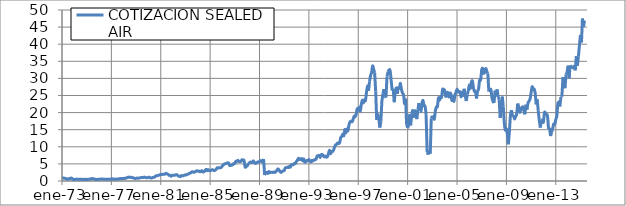
| Category | COTIZACIÓN SEALED AIR |
|---|---|
| 26666.0 | 1 |
| 26697.0 | 0.898 |
| 26725.0 | 0.805 |
| 26756.0 | 0.797 |
| 26786.0 | 0.656 |
| 26817.0 | 0.594 |
| 26847.0 | 0.555 |
| 26878.0 | 0.719 |
| 26909.0 | 0.688 |
| 26939.0 | 0.883 |
| 26970.0 | 0.68 |
| 27000.0 | 0.469 |
| 27031.0 | 0.477 |
| 27062.0 | 0.445 |
| 27090.0 | 0.555 |
| 27121.0 | 0.508 |
| 27151.0 | 0.477 |
| 27182.0 | 0.477 |
| 27212.0 | 0.492 |
| 27243.0 | 0.523 |
| 27274.0 | 0.492 |
| 27304.0 | 0.406 |
| 27335.0 | 0.484 |
| 27365.0 | 0.5 |
| 27396.0 | 0.43 |
| 27427.0 | 0.484 |
| 27455.0 | 0.523 |
| 27486.0 | 0.555 |
| 27516.0 | 0.562 |
| 27547.0 | 0.711 |
| 27577.0 | 0.703 |
| 27608.0 | 0.594 |
| 27639.0 | 0.547 |
| 27669.0 | 0.438 |
| 27700.0 | 0.414 |
| 27730.0 | 0.484 |
| 27761.0 | 0.508 |
| 27792.0 | 0.516 |
| 27821.0 | 0.594 |
| 27852.0 | 0.578 |
| 27882.0 | 0.547 |
| 27913.0 | 0.484 |
| 27943.0 | 0.547 |
| 27974.0 | 0.516 |
| 28005.0 | 0.531 |
| 28035.0 | 0.516 |
| 28066.0 | 0.477 |
| 28096.0 | 0.5 |
| 28127.0 | 0.641 |
| 28158.0 | 0.633 |
| 28186.0 | 0.508 |
| 28217.0 | 0.547 |
| 28247.0 | 0.586 |
| 28278.0 | 0.516 |
| 28308.0 | 0.547 |
| 28339.0 | 0.656 |
| 28370.0 | 0.656 |
| 28400.0 | 0.766 |
| 28431.0 | 0.656 |
| 28461.0 | 0.734 |
| 28492.0 | 0.711 |
| 28523.0 | 0.805 |
| 28551.0 | 0.766 |
| 28582.0 | 0.922 |
| 28612.0 | 1.062 |
| 28643.0 | 1.141 |
| 28673.0 | 1.039 |
| 28704.0 | 1.133 |
| 28735.0 | 0.977 |
| 28765.0 | 0.961 |
| 28796.0 | 0.844 |
| 28826.0 | 0.734 |
| 28857.0 | 0.773 |
| 28888.0 | 0.875 |
| 28916.0 | 0.828 |
| 28947.0 | 0.844 |
| 28977.0 | 0.945 |
| 29008.0 | 1 |
| 29038.0 | 1.008 |
| 29069.0 | 1.008 |
| 29100.0 | 1.148 |
| 29130.0 | 1.031 |
| 29161.0 | 0.938 |
| 29191.0 | 0.953 |
| 29222.0 | 1.086 |
| 29253.0 | 1.07 |
| 29282.0 | 0.922 |
| 29313.0 | 0.867 |
| 29343.0 | 1.016 |
| 29374.0 | 1.062 |
| 29404.0 | 1.125 |
| 29435.0 | 1.445 |
| 29466.0 | 1.562 |
| 29496.0 | 1.57 |
| 29527.0 | 1.711 |
| 29557.0 | 1.734 |
| 29588.0 | 1.953 |
| 29619.0 | 1.867 |
| 29647.0 | 1.953 |
| 29678.0 | 1.938 |
| 29708.0 | 1.984 |
| 29739.0 | 2.242 |
| 29769.0 | 2.102 |
| 29800.0 | 1.961 |
| 29831.0 | 1.703 |
| 29861.0 | 1.672 |
| 29892.0 | 1.383 |
| 29922.0 | 1.641 |
| 29953.0 | 1.695 |
| 29984.0 | 1.648 |
| 30012.0 | 1.727 |
| 30043.0 | 1.812 |
| 30073.0 | 1.805 |
| 30104.0 | 1.477 |
| 30134.0 | 1.398 |
| 30165.0 | 1.266 |
| 30196.0 | 1.586 |
| 30226.0 | 1.5 |
| 30257.0 | 1.562 |
| 30287.0 | 1.734 |
| 30318.0 | 1.719 |
| 30349.0 | 1.836 |
| 30377.0 | 1.984 |
| 30408.0 | 2.047 |
| 30438.0 | 2.234 |
| 30469.0 | 2.359 |
| 30499.0 | 2.609 |
| 30530.0 | 2.719 |
| 30561.0 | 2.516 |
| 30591.0 | 2.656 |
| 30622.0 | 2.781 |
| 30652.0 | 3 |
| 30683.0 | 2.875 |
| 30714.0 | 2.922 |
| 30743.0 | 2.688 |
| 30774.0 | 2.812 |
| 30804.0 | 3.016 |
| 30835.0 | 2.625 |
| 30865.0 | 2.734 |
| 30896.0 | 3 |
| 30927.0 | 3.406 |
| 30957.0 | 3 |
| 30988.0 | 3.344 |
| 31018.0 | 3.062 |
| 31049.0 | 3 |
| 31080.0 | 3.141 |
| 31108.0 | 3.281 |
| 31139.0 | 3.219 |
| 31169.0 | 3.031 |
| 31200.0 | 3.188 |
| 31230.0 | 3.469 |
| 31261.0 | 3.875 |
| 31292.0 | 3.797 |
| 31322.0 | 3.891 |
| 31353.0 | 3.844 |
| 31383.0 | 4.031 |
| 31414.0 | 4.438 |
| 31445.0 | 4.734 |
| 31473.0 | 4.984 |
| 31504.0 | 5.047 |
| 31534.0 | 5.188 |
| 31565.0 | 5.297 |
| 31595.0 | 5.25 |
| 31626.0 | 4.547 |
| 31657.0 | 4.547 |
| 31687.0 | 4.641 |
| 31718.0 | 4.75 |
| 31748.0 | 5.094 |
| 31779.0 | 5.141 |
| 31810.0 | 5.781 |
| 31838.0 | 5.672 |
| 31869.0 | 6.062 |
| 31899.0 | 5.719 |
| 31930.0 | 5.703 |
| 31960.0 | 5.734 |
| 31991.0 | 6.203 |
| 32022.0 | 6.062 |
| 32052.0 | 6.016 |
| 32083.0 | 4.109 |
| 32113.0 | 4.234 |
| 32144.0 | 4.406 |
| 32175.0 | 4.891 |
| 32204.0 | 5.25 |
| 32235.0 | 5.516 |
| 32265.0 | 5.484 |
| 32296.0 | 5.391 |
| 32326.0 | 5.891 |
| 32357.0 | 5.453 |
| 32388.0 | 5.125 |
| 32418.0 | 5.281 |
| 32449.0 | 5.547 |
| 32479.0 | 5.5 |
| 32510.0 | 5.688 |
| 32541.0 | 5.953 |
| 32569.0 | 5.891 |
| 32600.0 | 5.531 |
| 32630.0 | 6.438 |
| 32661.0 | 1.797 |
| 32691.0 | 2.156 |
| 32722.0 | 2.547 |
| 32753.0 | 2.172 |
| 32783.0 | 2.766 |
| 32814.0 | 2.422 |
| 32844.0 | 2.562 |
| 32875.0 | 2.578 |
| 32906.0 | 2.5 |
| 32934.0 | 2.625 |
| 32965.0 | 2.5 |
| 32995.0 | 2.719 |
| 33026.0 | 3.156 |
| 33056.0 | 3.547 |
| 33087.0 | 3.234 |
| 33118.0 | 2.719 |
| 33148.0 | 2.516 |
| 33179.0 | 2.781 |
| 33209.0 | 2.938 |
| 33240.0 | 3.062 |
| 33271.0 | 3.781 |
| 33299.0 | 3.938 |
| 33330.0 | 4.031 |
| 33360.0 | 3.922 |
| 33391.0 | 4.281 |
| 33421.0 | 4.031 |
| 33452.0 | 4.734 |
| 33483.0 | 4.781 |
| 33513.0 | 4.75 |
| 33544.0 | 5.188 |
| 33574.0 | 5.109 |
| 33605.0 | 5.734 |
| 33636.0 | 6.188 |
| 33665.0 | 6.656 |
| 33696.0 | 6.281 |
| 33726.0 | 6.344 |
| 33757.0 | 6.562 |
| 33787.0 | 5.875 |
| 33818.0 | 6.453 |
| 33849.0 | 5.531 |
| 33879.0 | 5.656 |
| 33910.0 | 6 |
| 33940.0 | 5.938 |
| 33971.0 | 6.281 |
| 34002.0 | 5.875 |
| 34030.0 | 5.562 |
| 34061.0 | 6 |
| 34091.0 | 5.844 |
| 34122.0 | 6.156 |
| 34152.0 | 6.219 |
| 34183.0 | 6.375 |
| 34214.0 | 7.25 |
| 34244.0 | 7.406 |
| 34275.0 | 7.469 |
| 34305.0 | 6.875 |
| 34336.0 | 7.656 |
| 34367.0 | 7.75 |
| 34395.0 | 7.469 |
| 34426.0 | 7.031 |
| 34456.0 | 7.281 |
| 34487.0 | 7 |
| 34517.0 | 7.062 |
| 34548.0 | 7.875 |
| 34579.0 | 9 |
| 34609.0 | 8 |
| 34640.0 | 8.594 |
| 34670.0 | 8.594 |
| 34701.0 | 9.062 |
| 34732.0 | 9.969 |
| 34760.0 | 10.531 |
| 34791.0 | 10.719 |
| 34821.0 | 11.125 |
| 34852.0 | 10.938 |
| 34882.0 | 11.219 |
| 34913.0 | 12.719 |
| 34944.0 | 13.031 |
| 34974.0 | 13.688 |
| 35005.0 | 13.25 |
| 35035.0 | 15.062 |
| 35066.0 | 14.062 |
| 35097.0 | 15.188 |
| 35126.0 | 14.688 |
| 35157.0 | 16.375 |
| 35187.0 | 17.25 |
| 35218.0 | 17.5 |
| 35248.0 | 17.312 |
| 35279.0 | 18 |
| 35310.0 | 18.938 |
| 35340.0 | 18.812 |
| 35371.0 | 19.562 |
| 35401.0 | 21.125 |
| 35432.0 | 20.75 |
| 35463.0 | 21.562 |
| 35491.0 | 20.438 |
| 35522.0 | 22.375 |
| 35552.0 | 23.625 |
| 35583.0 | 22.812 |
| 35613.0 | 23.719 |
| 35644.0 | 23.5 |
| 35675.0 | 25.938 |
| 35705.0 | 27.75 |
| 35736.0 | 26.375 |
| 35766.0 | 29.156 |
| 35797.0 | 30.875 |
| 35828.0 | 31.75 |
| 35856.0 | 33.656 |
| 35887.0 | 32.685 |
| 35917.0 | 31.625 |
| 35948.0 | 26.125 |
| 35978.0 | 17.875 |
| 36009.0 | 19.688 |
| 36040.0 | 18.25 |
| 36070.0 | 15.625 |
| 36101.0 | 17.406 |
| 36131.0 | 23.375 |
| 36162.0 | 25.531 |
| 36193.0 | 26.875 |
| 36221.0 | 24.656 |
| 36252.0 | 24.438 |
| 36282.0 | 30.5 |
| 36313.0 | 31.914 |
| 36343.0 | 32.469 |
| 36374.0 | 32.281 |
| 36405.0 | 29.469 |
| 36435.0 | 26.469 |
| 36466.0 | 26.969 |
| 36496.0 | 23.031 |
| 36527.0 | 26.094 |
| 36558.0 | 27.188 |
| 36587.0 | 25.5 |
| 36618.0 | 27.625 |
| 36648.0 | 27.156 |
| 36679.0 | 28.562 |
| 36709.0 | 26.875 |
| 36740.0 | 25.719 |
| 36771.0 | 25.219 |
| 36801.0 | 22.375 |
| 36832.0 | 24.125 |
| 36862.0 | 16.656 |
| 36893.0 | 15.562 |
| 36924.0 | 15.87 |
| 36952.0 | 19.495 |
| 36983.0 | 16.275 |
| 37013.0 | 19.365 |
| 37044.0 | 20.615 |
| 37074.0 | 18.835 |
| 37105.0 | 20.49 |
| 37136.0 | 20.09 |
| 37166.0 | 18.09 |
| 37197.0 | 20.825 |
| 37227.0 | 22.8 |
| 37258.0 | 20.445 |
| 37289.0 | 20.5 |
| 37317.0 | 22.67 |
| 37348.0 | 23.54 |
| 37378.0 | 22.01 |
| 37409.0 | 21.855 |
| 37439.0 | 19.365 |
| 37470.0 | 8.42 |
| 37501.0 | 7.745 |
| 37531.0 | 8.68 |
| 37562.0 | 7.95 |
| 37592.0 | 18.32 |
| 37623.0 | 19.05 |
| 37654.0 | 18.86 |
| 37682.0 | 18.075 |
| 37713.0 | 20.5 |
| 37743.0 | 21.645 |
| 37774.0 | 21.74 |
| 37804.0 | 24.3 |
| 37835.0 | 23.615 |
| 37866.0 | 24.655 |
| 37896.0 | 24.455 |
| 37927.0 | 26.765 |
| 37957.0 | 26.67 |
| 37988.0 | 26.52 |
| 38019.0 | 24.76 |
| 38048.0 | 25.38 |
| 38079.0 | 25.9 |
| 38109.0 | 24.575 |
| 38140.0 | 25.57 |
| 38170.0 | 25.53 |
| 38201.0 | 23.535 |
| 38232.0 | 24.805 |
| 38262.0 | 23.275 |
| 38293.0 | 25.1 |
| 38323.0 | 25.86 |
| 38354.0 | 26.85 |
| 38385.0 | 26.075 |
| 38413.0 | 26.13 |
| 38444.0 | 26.015 |
| 38474.0 | 24.575 |
| 38505.0 | 25.95 |
| 38535.0 | 25.02 |
| 38566.0 | 26.97 |
| 38597.0 | 24.995 |
| 38627.0 | 23.375 |
| 38658.0 | 25.28 |
| 38688.0 | 26.415 |
| 38719.0 | 28.085 |
| 38750.0 | 27.045 |
| 38778.0 | 28.84 |
| 38809.0 | 29.275 |
| 38839.0 | 27.305 |
| 38870.0 | 26.19 |
| 38900.0 | 26.2 |
| 38931.0 | 24.12 |
| 38962.0 | 26.315 |
| 38992.0 | 26.885 |
| 39023.0 | 29.485 |
| 39053.0 | 29.575 |
| 39084.0 | 32.46 |
| 39115.0 | 32.895 |
| 39143.0 | 31.52 |
| 39174.0 | 31.86 |
| 39204.0 | 32.91 |
| 39235.0 | 32.08 |
| 39265.0 | 31.47 |
| 39296.0 | 26.15 |
| 39327.0 | 26.45 |
| 39357.0 | 26.74 |
| 39388.0 | 24.32 |
| 39418.0 | 23.29 |
| 39449.0 | 22.81 |
| 39480.0 | 26.41 |
| 39509.0 | 24.76 |
| 39540.0 | 26.8 |
| 39570.0 | 24.53 |
| 39601.0 | 23.88 |
| 39631.0 | 18.42 |
| 39662.0 | 21.71 |
| 39693.0 | 24.7 |
| 39723.0 | 21.68 |
| 39754.0 | 16.94 |
| 39784.0 | 14.89 |
| 39815.0 | 15.25 |
| 39846.0 | 13.5 |
| 39874.0 | 10.73 |
| 39905.0 | 14.65 |
| 39935.0 | 19.15 |
| 39966.0 | 20.73 |
| 39996.0 | 18.78 |
| 40027.0 | 18.95 |
| 40058.0 | 18.11 |
| 40088.0 | 18.78 |
| 40119.0 | 19.65 |
| 40149.0 | 22.65 |
| 40180.0 | 21.86 |
| 40211.0 | 20.12 |
| 40239.0 | 20.78 |
| 40270.0 | 21.33 |
| 40300.0 | 21.68 |
| 40331.0 | 20.64 |
| 40361.0 | 19.49 |
| 40392.0 | 22.32 |
| 40423.0 | 20.85 |
| 40453.0 | 22.73 |
| 40484.0 | 23.35 |
| 40514.0 | 23.98 |
| 40545.0 | 25.76 |
| 40576.0 | 27.55 |
| 40604.0 | 26.92 |
| 40635.0 | 26.9 |
| 40665.0 | 25.78 |
| 40696.0 | 22.4 |
| 40726.0 | 23.87 |
| 40757.0 | 20.52 |
| 40788.0 | 17.75 |
| 40818.0 | 15.61 |
| 40849.0 | 17.75 |
| 40879.0 | 17.82 |
| 40910.0 | 17.21 |
| 40941.0 | 20.02 |
| 40970.0 | 19.78 |
| 41001.0 | 19.42 |
| 41031.0 | 18.95 |
| 41062.0 | 15.26 |
| 41092.0 | 15.54 |
| 41123.0 | 13.15 |
| 41154.0 | 14.27 |
| 41184.0 | 15.35 |
| 41215.0 | 16.67 |
| 41245.0 | 16.54 |
| 41276.0 | 17.94 |
| 41307.0 | 19.08 |
| 41335.0 | 22.38 |
| 41366.0 | 23.05 |
| 41396.0 | 21.77 |
| 41427.0 | 24.52 |
| 41457.0 | 24.65 |
| 41488.0 | 30.36 |
| 41519.0 | 28.4 |
| 41549.0 | 27.12 |
| 41580.0 | 31.21 |
| 41610.0 | 31.81 |
| 41641.0 | 33.73 |
| 41672.0 | 30.03 |
| 41700.0 | 33.79 |
| 41731.0 | 33.45 |
| 41761.0 | 33.2 |
| 41792.0 | 33.13 |
| 41822.0 | 33.53 |
| 41853.0 | 32.35 |
| 41884.0 | 36.49 |
| 41914.0 | 33.67 |
| 41945.0 | 36.34 |
| 41975.0 | 39.5 |
| 42006.0 | 42.7 |
| 42037.0 | 40.5 |
| 42065.0 | 47.51 |
| 42096.0 | 45.09 |
| 42126.0 | 46.93 |